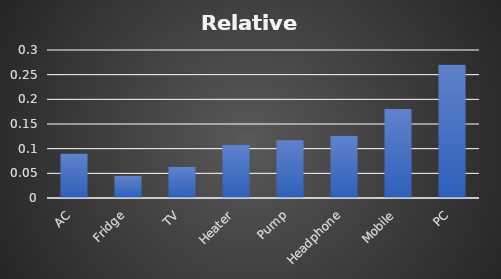
| Category | Relative Frequency |
|---|---|
| AC | 0.09 |
| Fridge | 0.045 |
| TV | 0.063 |
| Heater | 0.108 |
| Pump | 0.117 |
| Headphone | 0.126 |
| Mobile | 0.18 |
| PC | 0.27 |